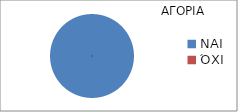
| Category | Series 0 |
|---|---|
| ΝΑΙ  | 1 |
| ΌΧΙ  | 0 |